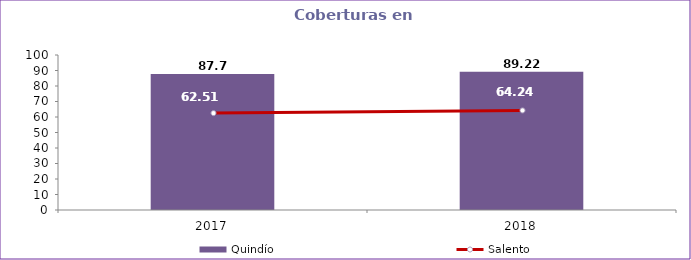
| Category | Quindío |
|---|---|
| 2017.0 | 87.7 |
| 2018.0 | 89.22 |